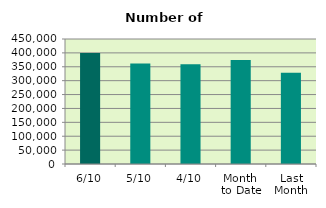
| Category | Series 0 |
|---|---|
| 6/10 | 400012 |
| 5/10 | 361896 |
| 4/10 | 358988 |
| Month 
to Date | 374266.5 |
| Last
Month | 328669.364 |